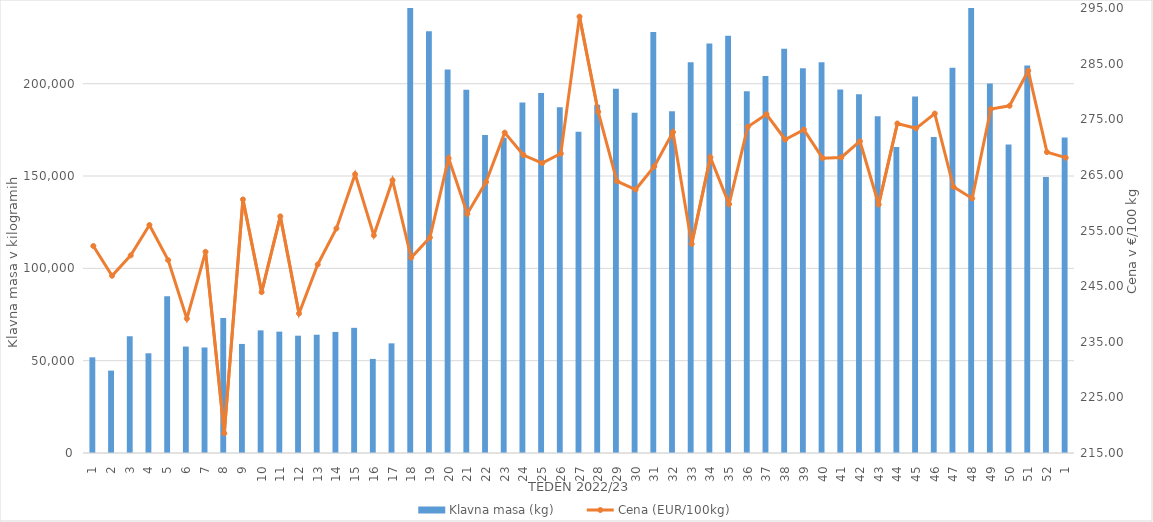
| Category | Klavna masa (kg) |
|---|---|
| 1.0 | 51818 |
| 2.0 | 44619 |
| 3.0 | 63233 |
| 4.0 | 53993 |
| 5.0 | 84871 |
| 6.0 | 57648 |
| 7.0 | 57159 |
| 8.0 | 73139 |
| 9.0 | 59056 |
| 10.0 | 66417 |
| 11.0 | 65723 |
| 12.0 | 63530 |
| 13.0 | 64069 |
| 14.0 | 65564 |
| 15.0 | 67787 |
| 16.0 | 50958 |
| 17.0 | 59387 |
| 18.0 | 241833 |
| 19.0 | 228389 |
| 20.0 | 207661 |
| 21.0 | 196732 |
| 22.0 | 172190 |
| 23.0 | 170751 |
| 24.0 | 189775 |
| 25.0 | 195029 |
| 26.0 | 187239 |
| 27.0 | 173967 |
| 28.0 | 188601 |
| 29.0 | 197293 |
| 30.0 | 184259 |
| 31.0 | 228023 |
| 32.0 | 185079 |
| 33.0 | 211612 |
| 34.0 | 221748 |
| 35.0 | 225927 |
| 36.0 | 195924 |
| 37.0 | 204224 |
| 38.0 | 218966 |
| 39.0 | 208403 |
| 40.0 | 211635 |
| 41.0 | 196841 |
| 42.0 | 194271 |
| 43.0 | 182399 |
| 44.0 | 165696 |
| 45.0 | 193022 |
| 46.0 | 171172 |
| 47.0 | 208597 |
| 48.0 | 253151 |
| 49.0 | 200117 |
| 50.0 | 167119 |
| 51.0 | 209797 |
| 52.0 | 149439 |
| 1.0 | 170843 |